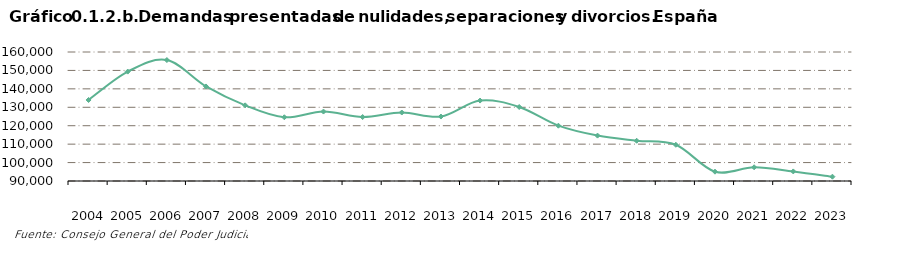
| Category | Series 0 |
|---|---|
|    2004 | 133964 |
|    2005 | 149367 |
|    2006 | 155628 |
|    2007 | 141304 |
|    2008 | 131060 |
|    2009 | 124590 |
|    2010 | 127682 |
|    2011 | 124702 |
|    2012 | 127160 |
|    2013 | 124975 |
|    2014 | 133643 |
|    2015 | 130141 |
|    2016 | 120018 |
|    2017 | 114633 |
|    2018 | 111838 |
|    2019 | 109667 |
|    2020 | 95060 |
|    2021 | 97449 |
|    2022 | 95193 |
|    2023 | 92344 |